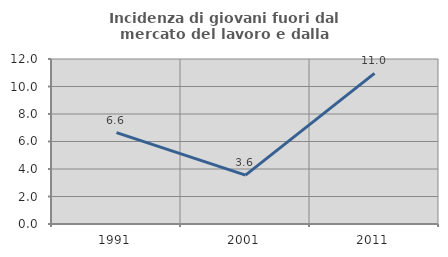
| Category | Incidenza di giovani fuori dal mercato del lavoro e dalla formazione  |
|---|---|
| 1991.0 | 6.643 |
| 2001.0 | 3.557 |
| 2011.0 | 10.959 |